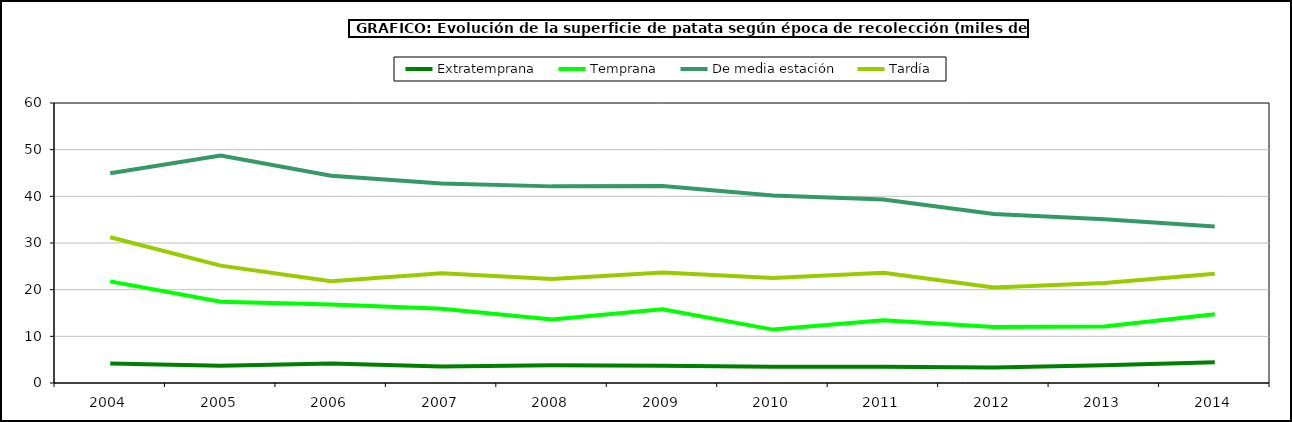
| Category | Extratemprana | Temprana | De media estación | Tardía |
|---|---|---|---|---|
| 2004.0 | 4.162 | 21.783 | 44.931 | 31.244 |
| 2005.0 | 3.674 | 17.435 | 48.734 | 25.155 |
| 2006.0 | 4.16 | 16.814 | 44.395 | 21.83 |
| 2007.0 | 3.542 | 15.925 | 42.735 | 23.526 |
| 2008.0 | 3.784 | 13.629 | 42.134 | 22.278 |
| 2009.0 | 3.713 | 15.804 | 42.188 | 23.661 |
| 2010.0 | 3.488 | 11.444 | 40.198 | 22.492 |
| 2011.0 | 3.471 | 13.439 | 39.332 | 23.623 |
| 2012.0 | 3.309 | 12.004 | 36.224 | 20.486 |
| 2013.0 | 3.821 | 12.091 | 35.096 | 21.424 |
| 2014.0 | 4.468 | 14.725 | 33.547 | 23.388 |